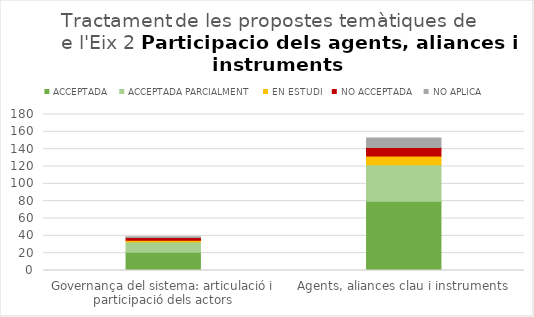
| Category | ACCEPTADA | ACCEPTADA PARCIALMENT | EN ESTUDI | NO ACCEPTADA | NO APLICA |
|---|---|---|---|---|---|
| Governança del sistema: articulació i participació dels actors | 21 | 12 | 2 | 3 | 1 |
| Agents, aliances clau i instruments | 80 | 42 | 10 | 10 | 11 |